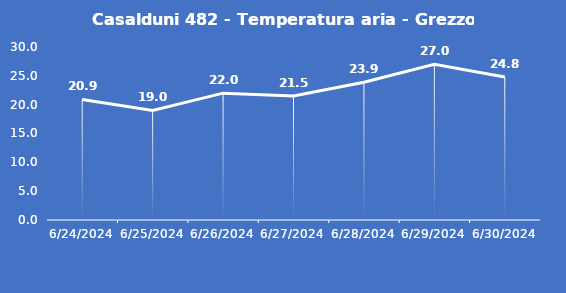
| Category | Casalduni 482 - Temperatura aria - Grezzo (°C) |
|---|---|
| 6/24/24 | 20.9 |
| 6/25/24 | 19 |
| 6/26/24 | 22 |
| 6/27/24 | 21.5 |
| 6/28/24 | 23.9 |
| 6/29/24 | 27 |
| 6/30/24 | 24.8 |